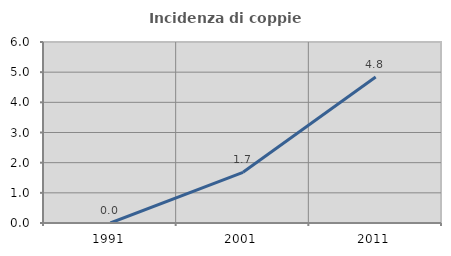
| Category | Incidenza di coppie miste |
|---|---|
| 1991.0 | 0 |
| 2001.0 | 1.681 |
| 2011.0 | 4.839 |